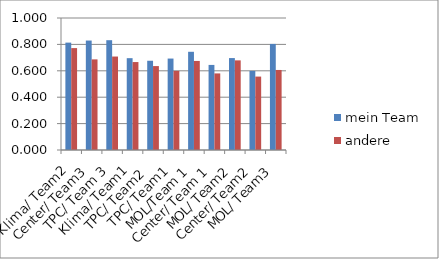
| Category | mein Team | andere |
|---|---|---|
| Klima/ Team2 | 0.813 | 0.772 |
| Center/ Team3 | 0.829 | 0.687 |
| TPC/ Team 3 | 0.832 | 0.708 |
| Klima/ Team1 | 0.696 | 0.666 |
| TPC/ Team2  | 0.676 | 0.636 |
| TPC/ Team1 | 0.693 | 0.599 |
| MOL/Team 1 | 0.744 | 0.675 |
| Center/ Team 1 | 0.645 | 0.58 |
| MOL/ Team2 | 0.696 | 0.679 |
| Center/ Team2 | 0.599 | 0.556 |
| MOL/ Team3 | 0.804 | 0.606 |